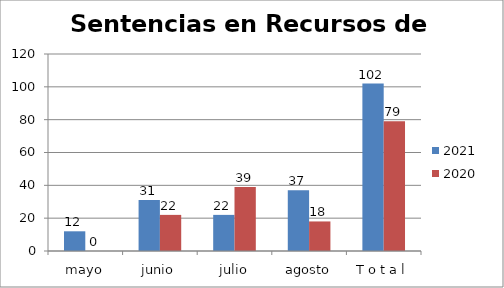
| Category | 2021 | 2020 |
|---|---|---|
| mayo | 12 | 0 |
| junio | 31 | 22 |
| julio | 22 | 39 |
| agosto | 37 | 18 |
| T o t a l | 102 | 79 |